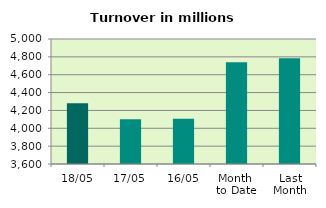
| Category | Series 0 |
|---|---|
| 18/05 | 4279.821 |
| 17/05 | 4100.177 |
| 16/05 | 4106.933 |
| Month 
to Date | 4738.564 |
| Last
Month | 4785.141 |